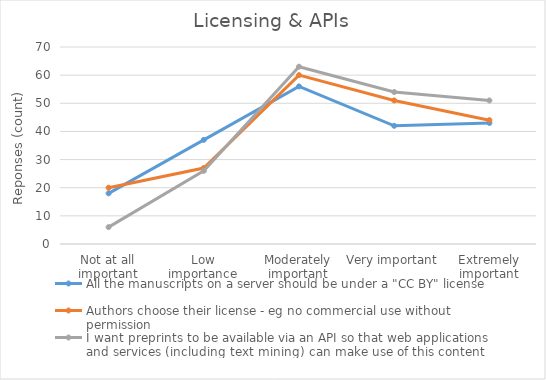
| Category | All the manuscripts on a server should be under a "CC BY" license | Authors choose their license - eg no commercial use without permission | I want preprints to be available via an API so that web applications and services (including text mining) can make use of this content |
|---|---|---|---|
| Not at all important | 18 | 20 | 6 |
| Low importance | 37 | 27 | 26 |
| Moderately important | 56 | 60 | 63 |
| Very important | 42 | 51 | 54 |
| Extremely important | 43 | 44 | 51 |